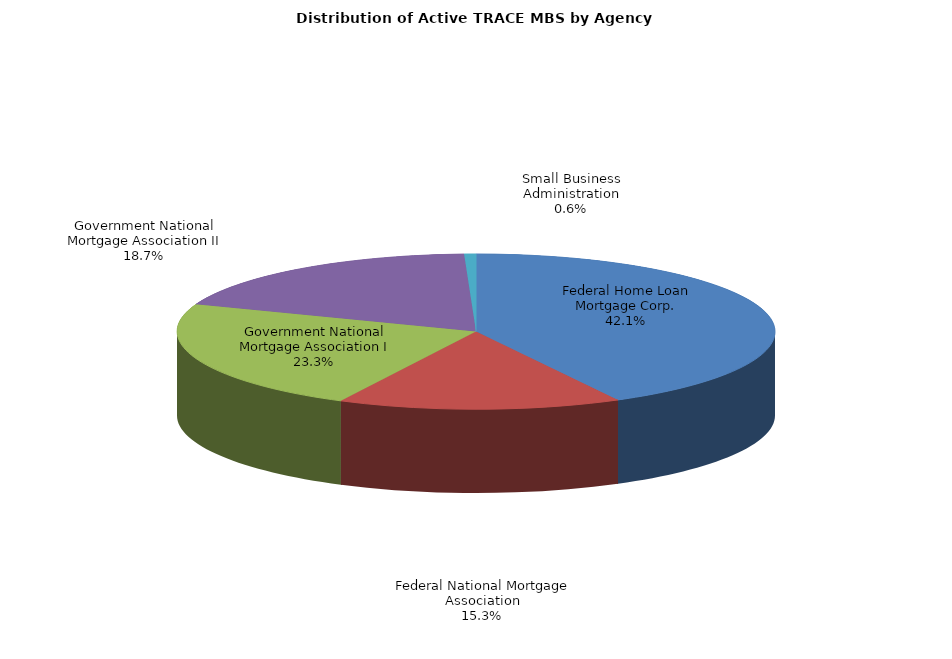
| Category | Series 0 |
|---|---|
| Federal Home Loan Mortgage Corp. | 275600 |
| Federal National Mortgage Association | 100332 |
| Government National Mortgage Association I | 152132 |
| Government National Mortgage Association II | 122046 |
| Small Business Administration | 4157 |